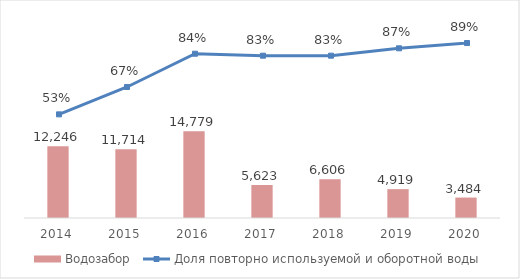
| Category | Водозабор |
|---|---|
| 2014.0 | 12246 |
| 2015.0 | 11714 |
| 2016.0 | 14779 |
| 2017.0 | 5623 |
| 2018.0 | 6606.43 |
| 2019.0 | 4918.53 |
| 2020.0 | 3483.569 |